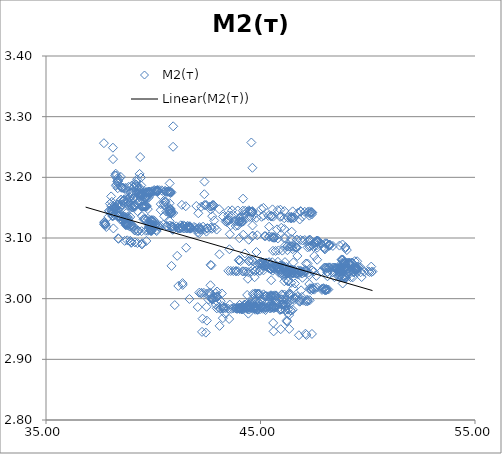
| Category | M2(т) |
|---|---|
| 36.8466682434082 | 1.551 |
| 37.6994400024414 | 3.256 |
| 38.1252288818359 | 3.23 |
| 38.2789344787598 | 3.203 |
| 38.2236251831055 | 3.203 |
| 38.2508888244629 | 3.206 |
| 38.4132614135742 | 3.198 |
| 38.4864120483398 | 3.201 |
| 38.3190498352051 | 3.198 |
| 38.3404922485352 | 3.194 |
| 38.292839050293 | 3.188 |
| 38.2607879638672 | 3.186 |
| 38.3443450927734 | 3.182 |
| 38.3514976501465 | 3.19 |
| 38.3239898681641 | 3.193 |
| 38.369815826416 | 3.194 |
| 38.4682922363281 | 3.186 |
| 38.5089530944824 | 3.184 |
| 38.521312713623 | 3.183 |
| 38.5624237060547 | 3.183 |
| 38.6135902404785 | 3.183 |
| 38.6564445495605 | 3.182 |
| 38.7172470092773 | 3.183 |
| 38.8511924743652 | 3.184 |
| 38.9959487915039 | 3.186 |
| 39.1181373596191 | 3.185 |
| 39.1987495422363 | 3.188 |
| 39.2380523681641 | 3.185 |
| 39.2809562683105 | 3.182 |
| 39.3547554016113 | 3.182 |
| 39.3679885864258 | 3.183 |
| 39.3649597167969 | 3.179 |
| 39.3949737548828 | 3.175 |
| 39.4136619567871 | 3.174 |
| 39.3420333862305 | 3.175 |
| 39.3627738952637 | 3.206 |
| 39.4356880187988 | 3.174 |
| 39.4679641723633 | 3.173 |
| 39.3996467590332 | 3.172 |
| 39.4515533447266 | 3.172 |
| 39.3494338989258 | 3.17 |
| 39.4420394897461 | 3.169 |
| 39.3887405395508 | 3.169 |
| 39.4053993225098 | 3.171 |
| 39.4506683349609 | 3.171 |
| 39.4600563049316 | 3.171 |
| 39.6278877258301 | 3.173 |
| 39.7151336669922 | 3.168 |
| 39.6557197570801 | 3.168 |
| 39.784236907959 | 3.166 |
| 39.6525421142578 | 3.164 |
| 39.6562728881836 | 3.167 |
| 39.6016159057617 | 3.167 |
| 39.5798721313477 | 3.168 |
| 39.6038475036621 | 3.167 |
| 39.6324806213379 | 3.173 |
| 39.6714248657227 | 3.175 |
| 39.6459350585937 | 3.176 |
| 39.676929473877 | 3.176 |
| 39.6829490661621 | 3.174 |
| 39.7198753356934 | 3.175 |
| 39.7467613220215 | 3.175 |
| 39.7862739562988 | 3.175 |
| 39.8236846923828 | 3.175 |
| 39.7817764282227 | 3.176 |
| 39.8027877807617 | 3.176 |
| 39.840145111084 | 3.176 |
| 39.8780059814453 | 3.175 |
| 39.9424476623535 | 3.176 |
| 40.0101356506348 | 3.177 |
| 40.0456466674805 | 3.179 |
| 40.0879516601562 | 3.178 |
| 40.1202392578125 | 3.178 |
| 40.154899597168 | 3.177 |
| 40.2038192749023 | 3.177 |
| 40.2207717895508 | 3.178 |
| 40.2089881896973 | 3.177 |
| 40.1680450439453 | 3.178 |
| 40.1817512512207 | 3.179 |
| 40.2020111083984 | 3.179 |
| 40.2154159545898 | 3.178 |
| 40.2009811401367 | 3.178 |
| 40.2103576660156 | 3.178 |
| 40.2322998046875 | 3.178 |
| 40.2776641845703 | 3.179 |
| 40.3890228271484 | 3.179 |
| 40.4242744445801 | 3.178 |
| 40.5500640869141 | 3.177 |
| 40.5572128295898 | 3.177 |
| 40.6336402893066 | 3.176 |
| 40.6303329467773 | 3.176 |
| 40.6712760925293 | 3.176 |
| 40.7076454162598 | 3.176 |
| 40.7392044067383 | 3.177 |
| 40.7707633972168 | 3.176 |
| 40.8457832336426 | 3.175 |
| 40.8117141723633 | 3.176 |
| 40.8083877563477 | 3.174 |
| 39.8167533874512 | 3.173 |
| 39.6430053710937 | 3.152 |
| 39.2664375305176 | 3.144 |
| 38.7043991088867 | 3.144 |
| 38.4202117919922 | 3.142 |
| 38.3407020568848 | 3.141 |
| 38.1084671020508 | 3.142 |
| 38.1073837280273 | 3.141 |
| 38.0158042907715 | 3.141 |
| 37.9384002685547 | 3.145 |
| 37.9482192993164 | 3.145 |
| 38.0468864440918 | 3.145 |
| 38.0695152282715 | 3.146 |
| 38.0815696716309 | 3.148 |
| 38.1715202331543 | 3.149 |
| 38.1314506530762 | 3.148 |
| 38.1841926574707 | 3.149 |
| 38.2325973510742 | 3.148 |
| 38.2218437194824 | 3.15 |
| 38.253734588623 | 3.149 |
| 38.4297752380371 | 3.149 |
| 38.3464736938477 | 3.152 |
| 38.3091354370117 | 3.147 |
| 38.251522064209 | 3.145 |
| 38.1932830810547 | 3.149 |
| 38.2493057250977 | 3.15 |
| 38.1490211486816 | 3.151 |
| 38.0419616699219 | 3.153 |
| 38.037052154541 | 3.169 |
| 38.1197319030762 | 3.249 |
| 38.0682678222656 | 3.16 |
| 38.195499420166 | 3.154 |
| 38.3160095214844 | 3.155 |
| 38.374641418457 | 3.155 |
| 38.5447387695313 | 3.155 |
| 38.8418121337891 | 3.154 |
| 38.955020904541 | 3.154 |
| 39.1231727600098 | 3.154 |
| 39.0814781188965 | 3.153 |
| 39.1459197998047 | 3.151 |
| 39.1146392822266 | 3.151 |
| 39.050350189209 | 3.15 |
| 38.9935302734375 | 3.151 |
| 39.0169525146484 | 3.151 |
| 39.0999794006348 | 3.152 |
| 39.1182098388672 | 3.152 |
| 39.1385803222656 | 3.155 |
| 39.1006889343262 | 3.183 |
| 39.2224159240723 | 3.193 |
| 39.1468620300293 | 3.189 |
| 39.2094764709473 | 3.188 |
| 39.3918075561523 | 3.233 |
| 39.4305267333984 | 3.2 |
| 39.4389686584473 | 3.187 |
| 39.4581451416016 | 3.17 |
| 39.44287109375 | 3.152 |
| 39.5500526428223 | 3.152 |
| 39.4846649169922 | 3.152 |
| 39.453857421875 | 3.152 |
| 39.4916687011719 | 3.152 |
| 39.5207862854004 | 3.152 |
| 39.578311920166 | 3.152 |
| 39.5894050598145 | 3.153 |
| 39.6257820129395 | 3.152 |
| 39.666446685791 | 3.154 |
| 39.6771850585937 | 3.152 |
| 39.6984939575195 | 3.153 |
| 39.7478637695313 | 3.148 |
| 39.8954429626465 | 3.172 |
| 39.9431648254395 | 3.177 |
| 39.8065910339355 | 3.176 |
| 39.8521766662598 | 3.175 |
| 39.868278503418 | 3.174 |
| 40.3340110778809 | 3.171 |
| 39.327808380127 | 3.173 |
| 38.7995300292969 | 3.177 |
| 38.991626739502 | 3.175 |
| 38.9982872009277 | 3.173 |
| 38.9430885314941 | 3.174 |
| 38.9925918579102 | 3.17 |
| 39.091869354248 | 3.166 |
| 38.8941497802734 | 3.168 |
| 38.9185523986816 | 3.166 |
| 38.8020248413086 | 3.132 |
| 38.8589744567871 | 3.132 |
| 38.775447845459 | 3.131 |
| 38.6370468139648 | 3.132 |
| 38.6057319641113 | 3.131 |
| 38.6423416137695 | 3.131 |
| 38.664436340332 | 3.13 |
| 38.5783500671387 | 3.129 |
| 38.4752883911133 | 3.13 |
| 38.5589218139648 | 3.129 |
| 38.6497039794922 | 3.164 |
| 38.5030975341797 | 3.163 |
| 38.496696472168 | 3.163 |
| 38.6072044372559 | 3.161 |
| 38.636905670166 | 3.163 |
| 38.6467628479004 | 3.162 |
| 38.610050201416 | 3.162 |
| 38.6395072937012 | 3.158 |
| 38.7244987487793 | 3.159 |
| 38.809154510498 | 3.163 |
| 38.8178863525391 | 3.16 |
| 38.9420967102051 | 3.156 |
| 38.8254432678223 | 3.125 |
| 38.7724266052246 | 3.124 |
| 38.7501754760742 | 3.124 |
| 38.9606018066406 | 3.123 |
| 38.9014053344727 | 3.124 |
| 38.8121948242188 | 3.124 |
| 38.7405624389648 | 3.122 |
| 38.7537879943848 | 3.123 |
| 38.6931381225586 | 3.124 |
| 38.7027015686035 | 3.125 |
| 38.7519302368164 | 3.124 |
| 38.6920127868652 | 3.124 |
| 38.7385330200195 | 3.141 |
| 38.7215881347656 | 3.131 |
| 38.7130126953125 | 3.121 |
| 38.7798538208008 | 3.121 |
| 38.8370323181152 | 3.121 |
| 38.9014167785645 | 3.119 |
| 38.9543991088867 | 3.12 |
| 38.9963531494141 | 3.12 |
| 39.0669364929199 | 3.12 |
| 39.1024780273438 | 3.117 |
| 39.1282997131348 | 3.113 |
| 39.148853302002 | 3.113 |
| 39.2411041259766 | 3.112 |
| 39.2872200012207 | 3.112 |
| 39.3078384399414 | 3.111 |
| 39.4544448852539 | 3.111 |
| 39.6471557617188 | 3.112 |
| 39.7491416931152 | 3.112 |
| 39.8859405517578 | 3.112 |
| 39.8912124633789 | 3.113 |
| 39.860408782959 | 3.113 |
| 39.9278564453125 | 3.112 |
| 39.9182281494141 | 3.113 |
| 39.8957824707031 | 3.112 |
| 39.8830146789551 | 3.113 |
| 39.9032211303711 | 3.114 |
| 39.889331817627 | 3.115 |
| 39.7785530090332 | 3.115 |
| 39.8928871154785 | 3.115 |
| 39.9346160888672 | 3.116 |
| 39.9755516052246 | 3.118 |
| 39.8780174255371 | 3.122 |
| 39.9108695983887 | 3.123 |
| 39.9489707946777 | 3.127 |
| 40.0525131225586 | 3.128 |
| 39.9914627075195 | 3.129 |
| 39.9455108642578 | 3.128 |
| 39.9452896118164 | 3.129 |
| 39.9015083312988 | 3.129 |
| 39.9266357421875 | 3.13 |
| 39.8418464660645 | 3.13 |
| 39.7503471374512 | 3.132 |
| 39.6369476318359 | 3.131 |
| 39.6120223999023 | 3.131 |
| 39.6067276000977 | 3.131 |
| 39.5427474975586 | 3.131 |
| 39.4790115356445 | 3.136 |
| 39.4441947937012 | 3.165 |
| 39.4007148742676 | 3.166 |
| 39.2907028198242 | 3.166 |
| 39.2226295471191 | 3.174 |
| 39.2482490539551 | 3.197 |
| 39.063404083252 | 3.164 |
| 39.091869354248 | 3.165 |
| 38.9248275756836 | 3.162 |
| 38.9293251037598 | 3.135 |
| 38.7998847961426 | 3.135 |
| 38.7319030761719 | 3.134 |
| 38.6788291931152 | 3.135 |
| 38.6014404296875 | 3.136 |
| 38.58935546875 | 3.135 |
| 38.5079345703125 | 3.136 |
| 38.3923950195313 | 3.135 |
| 38.3737525939941 | 3.136 |
| 38.3372840881348 | 3.136 |
| 38.3794441223145 | 3.136 |
| 38.4328308105469 | 3.136 |
| 38.3685111999512 | 3.137 |
| 38.3542289733887 | 3.136 |
| 38.2104263305664 | 3.138 |
| 38.1323394775391 | 3.137 |
| 38.1013565063477 | 3.137 |
| 38.1035652160645 | 3.136 |
| 37.9150390625 | 3.135 |
| 37.9805450439453 | 3.157 |
| 37.7783546447754 | 3.123 |
| 37.7770347595215 | 3.121 |
| 37.7066459655762 | 3.122 |
| 37.7183609008789 | 3.126 |
| 37.7170372009277 | 3.126 |
| 37.7328071594238 | 3.124 |
| 37.7420234680176 | 3.123 |
| 37.8122367858887 | 3.118 |
| 38.1417541503906 | 3.116 |
| 38.3659553527832 | 3.1 |
| 38.3780708312988 | 3.099 |
| 38.6676483154297 | 3.095 |
| 38.7870788574219 | 3.096 |
| 38.9253807067871 | 3.095 |
| 38.9381256103516 | 3.095 |
| 38.9854965209961 | 3.093 |
| 38.9722633361816 | 3.092 |
| 39.1452178955078 | 3.093 |
| 39.2611961364746 | 3.092 |
| 39.4820404052734 | 3.091 |
| 39.4731407165527 | 3.089 |
| 39.6801719665527 | 3.095 |
| 39.7836837768555 | 3.127 |
| 39.8151550292969 | 3.122 |
| 39.9658203125 | 3.123 |
| 40.0737648010254 | 3.121 |
| 40.1881942749023 | 3.121 |
| 40.287914276123 | 3.118 |
| 40.3494529724121 | 3.146 |
| 40.5062942504883 | 3.136 |
| 40.6074066162109 | 3.144 |
| 40.7360649108887 | 3.144 |
| 40.7737998962402 | 3.144 |
| 40.8051567077637 | 3.143 |
| 40.835636138916 | 3.141 |
| 40.8468894958496 | 3.141 |
| 40.8316040039063 | 3.14 |
| 40.8144302368164 | 3.14 |
| 40.932315826416 | 3.141 |
| 40.7516975402832 | 3.14 |
| 40.8481292724609 | 3.142 |
| 40.7739295959473 | 3.144 |
| 40.7965774536133 | 3.146 |
| 40.7961235046387 | 3.147 |
| 40.7968444824219 | 3.148 |
| 40.7682952880859 | 3.149 |
| 40.7666435241699 | 3.19 |
| 40.9297218322754 | 3.284 |
| 40.9250106811523 | 3.25 |
| 40.5572967529297 | 3.159 |
| 40.5504455566406 | 3.161 |
| 40.5598182678223 | 3.161 |
| 40.487678527832 | 3.158 |
| 40.5068244934082 | 3.154 |
| 40.35009765625 | 3.156 |
| 40.7653045654297 | 3.157 |
| 41.3327026367188 | 3.155 |
| 41.5155944824219 | 3.152 |
| 42.00830078125 | 3.153 |
| 42.2348327636719 | 3.151 |
| 42.7167892456055 | 3.152 |
| 42.3842277526855 | 3.154 |
| 42.4523963928223 | 3.154 |
| 42.8240699768066 | 3.154 |
| 42.7607917785645 | 3.154 |
| 42.7823333740234 | 3.155 |
| 42.8251037597656 | 3.154 |
| 42.728759765625 | 3.153 |
| 42.6401443481445 | 3.152 |
| 42.4693031311035 | 3.154 |
| 42.3815536499023 | 3.172 |
| 42.3883285522461 | 3.193 |
| 40.7673950195313 | 3.128 |
| 40.2436637878418 | 3.119 |
| 40.9234237670898 | 3.114 |
| 40.9061813354492 | 3.113 |
| 41.1469383239746 | 3.116 |
| 41.6971244812012 | 3.115 |
| 42.0052680969238 | 3.114 |
| 42.199893951416 | 3.114 |
| 42.2527847290039 | 3.114 |
| 42.182445526123 | 3.115 |
| 42.0988006591797 | 3.115 |
| 41.7291145324707 | 3.116 |
| 41.5760650634766 | 3.117 |
| 41.3604927062988 | 3.117 |
| 41.1958503723145 | 3.116 |
| 41.152400970459 | 3.117 |
| 40.9412460327148 | 3.118 |
| 40.8941459655762 | 3.118 |
| 40.8450393676758 | 3.119 |
| 40.770320892334 | 3.121 |
| 40.6128997802734 | 3.12 |
| 40.4683036804199 | 3.122 |
| 40.2287940979004 | 3.12 |
| 40.1058921813965 | 3.121 |
| 39.8997917175293 | 3.122 |
| 39.9675903320313 | 3.122 |
| 40.0024032592773 | 3.119 |
| 40.1382942199707 | 3.113 |
| 40.1584510803223 | 3.111 |
| 40.0749130249023 | 3.118 |
| 39.8869972229004 | 3.12 |
| 39.8195953369141 | 3.119 |
| 39.9309768676758 | 3.12 |
| 39.8077926635742 | 3.12 |
| 40.3221054077148 | 3.12 |
| 40.6460189819336 | 3.12 |
| 40.8644828796387 | 3.119 |
| 41.0732841491699 | 3.119 |
| 41.4582748413086 | 3.12 |
| 41.6849021911621 | 3.118 |
| 41.8998718261719 | 3.118 |
| 42.1544761657715 | 3.118 |
| 42.3233642578125 | 3.119 |
| 42.5246162414551 | 3.116 |
| 42.6884460449219 | 3.117 |
| 42.8500900268555 | 3.117 |
| 42.955379486084 | 3.114 |
| 42.7236061096191 | 3.115 |
| 42.5124130249023 | 3.115 |
| 42.4139022827148 | 3.115 |
| 42.1539268493652 | 3.116 |
| 41.9674186706543 | 3.117 |
| 41.772331237793 | 3.116 |
| 41.7276344299316 | 3.115 |
| 41.552547454834 | 3.117 |
| 41.4322700500488 | 3.116 |
| 41.3302612304687 | 3.117 |
| 41.2588768005371 | 3.116 |
| 41.2427787780762 | 3.116 |
| 41.3566131591797 | 3.118 |
| 41.2838859558105 | 3.121 |
| 41.3966789245605 | 3.121 |
| 41.6122512817383 | 3.12 |
| 41.5923652648926 | 3.12 |
| 41.7057685852051 | 3.119 |
| 41.6770858764648 | 3.117 |
| 41.6771659851074 | 3.118 |
| 41.722469329834 | 3.117 |
| 41.7500839233398 | 3.117 |
| 41.5450096130371 | 3.116 |
| 41.5947151184082 | 3.116 |
| 41.5343475341797 | 3.084 |
| 41.3660545349121 | 3.026 |
| 41.1681632995605 | 3.021 |
| 41.3730430603027 | 3.023 |
| 41.1160888671875 | 3.071 |
| 41.3185691833496 | 3.117 |
| 42.1013832092285 | 3.141 |
| 42.6840400695801 | 3.147 |
| 43.0749397277832 | 3.147 |
| 43.5007019042969 | 3.145 |
| 43.678394317627 | 3.146 |
| 43.9417915344238 | 3.145 |
| 44.1777229309082 | 3.145 |
| 44.2868766784668 | 3.145 |
| 44.4133758544922 | 3.144 |
| 44.4562835693359 | 3.146 |
| 44.5097923278809 | 3.144 |
| 44.5850219726562 | 3.144 |
| 44.6205177307129 | 3.144 |
| 44.621768951416 | 3.142 |
| 44.6177673339844 | 3.143 |
| 44.5895042419434 | 3.143 |
| 44.5570259094238 | 3.143 |
| 44.6231689453125 | 3.216 |
| 44.5733489990234 | 3.257 |
| 44.1857223510742 | 3.165 |
| 43.9425888061523 | 3.121 |
| 43.8432960510254 | 3.12 |
| 43.6144485473633 | 3.121 |
| 43.5322113037109 | 3.129 |
| 43.4332160949707 | 3.126 |
| 43.3750534057617 | 3.127 |
| 43.5173263549805 | 3.132 |
| 43.4488906860352 | 3.129 |
| 43.4237251281738 | 3.129 |
| 43.4955825805664 | 3.13 |
| 43.760555267334 | 3.128 |
| 43.8561859130859 | 3.128 |
| 43.9407424926758 | 3.128 |
| 43.9990119934082 | 3.126 |
| 44.1057739257812 | 3.126 |
| 44.1950187683105 | 3.127 |
| 44.132137298584 | 3.126 |
| 44.1474838256836 | 3.127 |
| 44.0995483398438 | 3.126 |
| 44.0567665100098 | 3.127 |
| 44.0087089538574 | 3.127 |
| 44.0809059143066 | 3.133 |
| 44.0091209411621 | 3.132 |
| 44.0137634277344 | 3.1 |
| 43.539852142334 | 2.967 |
| 43.243408203125 | 2.968 |
| 43.0928916931152 | 2.955 |
| 43.2272911071777 | 2.988 |
| 43.1454429626465 | 2.996 |
| 42.9504661560059 | 2.996 |
| 42.981990814209 | 3.003 |
| 42.9911270141602 | 3.003 |
| 42.9657402038574 | 3.004 |
| 42.9591407775879 | 3.003 |
| 42.9046440124512 | 3.002 |
| 42.8694267272949 | 3.002 |
| 42.8040428161621 | 3.002 |
| 42.7572479248047 | 3.001 |
| 42.7334823608398 | 3 |
| 42.7448081970215 | 3 |
| 42.7453422546387 | 3 |
| 42.7564125061035 | 2.998 |
| 42.715705871582 | 2.999 |
| 42.6686401367188 | 3.022 |
| 42.7111625671387 | 3.055 |
| 42.5720329284668 | 2.998 |
| 42.2993125915527 | 2.967 |
| 42.2736892700195 | 2.945 |
| 42.4515800476074 | 2.944 |
| 42.4994430541992 | 2.964 |
| 42.6739044189453 | 3.056 |
| 42.8443298339844 | 3.129 |
| 43.2516288757324 | 3.135 |
| 43.495979309082 | 3.137 |
| 44.0441436767578 | 3.134 |
| 44.486629486084 | 3.135 |
| 44.8056488037109 | 3.133 |
| 45.1423683166504 | 3.137 |
| 45.3704376220703 | 3.137 |
| 45.5232429504395 | 3.136 |
| 45.5973625183105 | 3.135 |
| 45.9724044799805 | 3.136 |
| 46.2575073242188 | 3.134 |
| 46.5669059753418 | 3.134 |
| 46.2907981872559 | 3.133 |
| 46.4642906188965 | 3.134 |
| 46.4630126953125 | 3.133 |
| 46.4377250671387 | 3.133 |
| 46.4135818481445 | 3.132 |
| 46.5559349060059 | 3.133 |
| 46.827205657959 | 3.131 |
| 46.1082153320313 | 3.133 |
| 44.5765953063965 | 3.135 |
| 44.1896514892578 | 3.134 |
| 43.6264228820801 | 3.137 |
| 42.748176574707 | 3.136 |
| 42.4766883850098 | 3.111 |
| 42.0685424804687 | 3.109 |
| 42.1413841247559 | 3.108 |
| 43.5722274780273 | 3.106 |
| 44.195686340332 | 3.105 |
| 44.8475875854492 | 3.105 |
| 45.1893692016602 | 3.103 |
| 45.2358512878418 | 3.103 |
| 45.4028129577637 | 3.103 |
| 45.405460357666 | 3.102 |
| 45.5218200683594 | 3.102 |
| 45.5841522216797 | 3.102 |
| 45.5965805053711 | 3.101 |
| 45.6159973144531 | 3.101 |
| 45.6312942504883 | 3.102 |
| 45.6663360595703 | 3.1 |
| 45.8107719421387 | 3.099 |
| 46.0968704223633 | 3.1 |
| 46.1508560180664 | 3.1 |
| 46.4222106933594 | 3.098 |
| 46.7028999328613 | 3.097 |
| 46.6903190612793 | 3.097 |
| 46.8613548278809 | 3.097 |
| 46.9676780700684 | 3.096 |
| 47.0625457763672 | 3.097 |
| 47.2122802734375 | 3.094 |
| 47.2562980651855 | 3.096 |
| 47.3001976013184 | 3.097 |
| 47.3238830566406 | 3.096 |
| 47.6293678283691 | 3.096 |
| 47.6438598632812 | 3.096 |
| 47.6304168701172 | 3.095 |
| 47.7070388793945 | 3.095 |
| 47.6133728027344 | 3.095 |
| 47.6036949157715 | 3.095 |
| 47.6183013916016 | 3.094 |
| 47.6702537536621 | 3.095 |
| 47.6185111999512 | 3.094 |
| 47.6535263061523 | 3.094 |
| 47.5188751220703 | 3.093 |
| 47.5789833068848 | 3.092 |
| 48.0847244262695 | 3.091 |
| 48.012321472168 | 3.091 |
| 48.0898361206055 | 3.09 |
| 48.2277717590332 | 3.089 |
| 48.2334098815918 | 3.088 |
| 48.1977424621582 | 3.089 |
| 48.2097244262695 | 3.087 |
| 47.920581817627 | 3.086 |
| 47.8298683166504 | 3.091 |
| 47.6311836242676 | 3.088 |
| 47.4225730895996 | 3.088 |
| 47.3089294433594 | 3.087 |
| 47.1954116821289 | 3.085 |
| 46.7027893066406 | 3.084 |
| 46.4505424499512 | 3.087 |
| 46.3530883789063 | 3.086 |
| 46.2669944763184 | 3.087 |
| 46.1399917602539 | 3.087 |
| 46.239688873291 | 3.086 |
| 46.394832611084 | 3.086 |
| 46.5088500976562 | 3.086 |
| 46.6332359313965 | 3.084 |
| 46.7061805725098 | 3.084 |
| 46.6623725891113 | 3.084 |
| 46.6573638916016 | 3.085 |
| 46.4563941955566 | 3.11 |
| 46.1119117736816 | 3.115 |
| 45.9715270996094 | 3.117 |
| 45.7717552185059 | 3.114 |
| 45.4950370788574 | 3.135 |
| 45.1360244750977 | 3.15 |
| 45.0320472717285 | 3.148 |
| 45.5603446960449 | 3.147 |
| 45.8027496337891 | 3.146 |
| 45.9268226623535 | 3.147 |
| 46.113655090332 | 3.144 |
| 46.5005569458008 | 3.144 |
| 46.7479591369629 | 3.142 |
| 46.8698463439941 | 3.144 |
| 46.8789939880371 | 3.143 |
| 47.0639839172363 | 3.143 |
| 47.2009391784668 | 3.143 |
| 47.280590057373 | 3.144 |
| 47.2806739807129 | 3.141 |
| 47.3621520996094 | 3.143 |
| 47.3414573669434 | 3.142 |
| 47.3952751159668 | 3.143 |
| 47.4144134521484 | 3.142 |
| 47.3860626220703 | 3.139 |
| 47.2784996032715 | 3.137 |
| 46.954158782959 | 3.135 |
| 46.4309463500977 | 3.135 |
| 45.9147491455078 | 3.135 |
| 45.4894332885742 | 3.136 |
| 45.0521621704102 | 3.135 |
| 44.6488227844238 | 3.136 |
| 44.2579040527344 | 3.139 |
| 44.2708511352539 | 3.075 |
| 44.0725479125977 | 3.062 |
| 44.0009689331055 | 3.064 |
| 43.9929885864258 | 3.063 |
| 44.4594764709473 | 3.061 |
| 44.5947189331055 | 3.063 |
| 44.6543960571289 | 3.062 |
| 45.0279846191406 | 3.061 |
| 45.3758163452148 | 3.059 |
| 45.5505294799805 | 3.06 |
| 45.811107635498 | 3.061 |
| 46.1409187316895 | 3.06 |
| 46.5342445373535 | 3.06 |
| 47.1186599731445 | 3.058 |
| 47.1960372924805 | 3.058 |
| 47.6432037353516 | 3.064 |
| 48.2092247009277 | 3.089 |
| 48.3736610412598 | 3.087 |
| 48.6837615966797 | 3.087 |
| 48.8235855102539 | 3.089 |
| 48.9542427062988 | 3.083 |
| 48.9644393920898 | 3.085 |
| 49.0256385803223 | 3.08 |
| 49.0178298950195 | 3.051 |
| 49.0243492126465 | 3.044 |
| 48.9084243774414 | 3.045 |
| 48.7630271911621 | 3.046 |
| 48.7224082946777 | 3.046 |
| 48.7636489868164 | 3.046 |
| 48.7141418457031 | 3.044 |
| 48.6787528991699 | 3.044 |
| 48.4080581665039 | 3.045 |
| 48.3767356872559 | 3.043 |
| 48.1061515808105 | 3.044 |
| 47.9365653991699 | 3.017 |
| 47.3987312316895 | 2.942 |
| 47.0946922302246 | 2.942 |
| 47.1410064697266 | 2.94 |
| 46.7901039123535 | 2.94 |
| 46.3419151306152 | 2.95 |
| 46.2251129150391 | 2.964 |
| 46.2343635559082 | 2.962 |
| 46.2863960266113 | 2.976 |
| 45.5918884277344 | 2.96 |
| 45.7432327270508 | 3.605 |
| 46.1293106079102 | 3.723 |
| 45.9106369018555 | 3.715 |
| 45.5552101135254 | 3.436 |
| 44.6464500427246 | 3.048 |
| 44.4291191101074 | 3.044 |
| 44.2522506713867 | 3.045 |
| 44.1737442016602 | 3.045 |
| 43.6110000610352 | 3.046 |
| 43.4989128112793 | 3.046 |
| 43.8412246704102 | 3.045 |
| 43.7345428466797 | 3.046 |
| 43.8779449462891 | 3.045 |
| 43.9614219665527 | 3.045 |
| 44.1643180847168 | 3.045 |
| 44.3325881958008 | 3.045 |
| 44.5504875183105 | 3.045 |
| 44.714656829834 | 3.045 |
| 44.7829704284668 | 3.046 |
| 44.9414138793945 | 3.046 |
| 44.9846382141113 | 3.046 |
| 45.1377067565918 | 3.047 |
| 45.5671920776367 | 3.046 |
| 45.4018745422363 | 3.06 |
| 45.2605094909668 | 3.059 |
| 45.1346206665039 | 3.059 |
| 45.0097541809082 | 3.058 |
| 45.0673332214355 | 3.059 |
| 45.1408500671387 | 3.059 |
| 44.9256362915039 | 3.058 |
| 45.0482177734375 | 3.058 |
| 44.846118927002 | 3.056 |
| 44.9780960083008 | 3.057 |
| 45.2099189758301 | 3.057 |
| 45.2935256958008 | 3.055 |
| 45.4687271118164 | 3.055 |
| 45.234317779541 | 3.055 |
| 45.2096252441406 | 3.055 |
| 45.0890960693359 | 3.054 |
| 45.2400398254395 | 3.054 |
| 45.517333984375 | 3.053 |
| 45.7754859924316 | 3.052 |
| 45.8626480102539 | 3.052 |
| 45.8495979309082 | 3.053 |
| 46.0246429443359 | 3.051 |
| 46.2043228149414 | 3.052 |
| 46.021900177002 | 3.053 |
| 46.1280174255371 | 3.05 |
| 46.0734596252441 | 3.051 |
| 46.0764999389648 | 3.053 |
| 46.143424987793 | 3.05 |
| 46.0175590515137 | 3.054 |
| 46.0253486633301 | 3.053 |
| 45.9128761291504 | 3.055 |
| 45.8609962463379 | 3.051 |
| 45.8792037963867 | 3.051 |
| 45.5437850952148 | 3.051 |
| 45.609504699707 | 3.05 |
| 45.5305366516113 | 3.052 |
| 45.3764762878418 | 3.05 |
| 45.6056480407715 | 3.051 |
| 45.6366996765137 | 3.05 |
| 45.8255729675293 | 3.05 |
| 45.6003913879395 | 3.051 |
| 45.4917411804199 | 3.049 |
| 45.5040092468262 | 3.049 |
| 45.4537773132324 | 3.049 |
| 45.4832420349121 | 3.048 |
| 45.6903114318848 | 3.052 |
| 45.7362365722656 | 3.055 |
| 45.8075103759766 | 3.051 |
| 45.8097305297852 | 3.049 |
| 45.7890892028809 | 3.049 |
| 45.8784027099609 | 3.048 |
| 45.9588775634766 | 3.048 |
| 46.285400390625 | 3.049 |
| 46.0361976623535 | 3.05 |
| 46.2828903198242 | 3.048 |
| 46.3733787536621 | 3.048 |
| 46.453987121582 | 3.048 |
| 46.5891799926758 | 3.047 |
| 46.524959564209 | 3.047 |
| 46.5014381408691 | 3.047 |
| 46.8623542785645 | 3.046 |
| 47.0863838195801 | 3.047 |
| 47.0884132385254 | 3.046 |
| 47.3889122009277 | 3.047 |
| 47.4063720703125 | 3.047 |
| 46.7586250305176 | 3.047 |
| 47.1466102600098 | 3.045 |
| 47.0492401123047 | 3.045 |
| 46.8954658508301 | 3.044 |
| 46.9313545227051 | 3.044 |
| 47.041088104248 | 3.043 |
| 46.7863426208496 | 3.045 |
| 46.8628921508789 | 3.043 |
| 46.9445190429687 | 3.041 |
| 46.8690032958984 | 3.043 |
| 46.7509078979492 | 3.043 |
| 46.5100212097168 | 3.042 |
| 46.3304710388184 | 3.042 |
| 46.2640228271484 | 3.042 |
| 46.2838096618652 | 3.042 |
| 46.2149772644043 | 3.041 |
| 46.1646308898926 | 3.041 |
| 46.2587089538574 | 3.043 |
| 46.309871673584 | 3.043 |
| 46.4101486206055 | 3.042 |
| 46.4716148376465 | 3.043 |
| 46.4744911193848 | 3.042 |
| 46.6221466064453 | 3.043 |
| 46.6063079833984 | 3.043 |
| 46.662467956543 | 3.042 |
| 46.7144050598145 | 3.042 |
| 46.6631202697754 | 3.041 |
| 46.4621276855469 | 3.041 |
| 46.2146148681641 | 3.043 |
| 45.9412231445313 | 3.042 |
| 45.8549613952637 | 3.043 |
| 46.0016593933105 | 3.043 |
| 46.096118927002 | 3.041 |
| 46.5514755249023 | 3.042 |
| 46.7640800476074 | 3.04 |
| 46.9585876464844 | 3.034 |
| 47.2748908996582 | 3.039 |
| 47.6035194396973 | 3.038 |
| 48.1223411560059 | 3.037 |
| 48.4483451843262 | 3.035 |
| 48.6435317993164 | 3.036 |
| 48.6869277954102 | 3.036 |
| 48.8631820678711 | 3.035 |
| 48.9726943969727 | 3.034 |
| 49.0158805847168 | 3.037 |
| 48.8202247619629 | 3.035 |
| 48.9006271362305 | 3.036 |
| 49.2057495117188 | 3.035 |
| 49.3027000427246 | 3.035 |
| 48.9050254821777 | 3.037 |
| 48.9432220458984 | 3.035 |
| 48.9768714904785 | 3.035 |
| 48.830867767334 | 3.025 |
| 48.6558685302734 | 3.046 |
| 43.0849494934082 | 3.073 |
| 40.8505401611328 | 3.054 |
| 41.6856803894043 | 2.999 |
| 41.0025482177734 | 2.989 |
| 42.0736083984375 | 2.986 |
| 43.0594711303711 | 2.985 |
| 43.3387680053711 | 2.976 |
| 44.4336929321289 | 2.975 |
| 44.9676933288574 | 2.996 |
| 45.2556991577148 | 3.004 |
| 45.3604431152344 | 3.004 |
| 45.549488067627 | 3.004 |
| 45.6508598327637 | 3.003 |
| 45.4746437072754 | 3.004 |
| 45.4496421813965 | 3.003 |
| 45.201847076416 | 3.004 |
| 44.951847076416 | 3.004 |
| 45.2126083374023 | 3.004 |
| 45.5345993041992 | 3.005 |
| 45.9919281005859 | 3.007 |
| 46.3028793334961 | 3.008 |
| 46.4378356933594 | 3.006 |
| 46.4004707336426 | 3.007 |
| 46.3900871276855 | 3.007 |
| 46.3574714660645 | 3.009 |
| 46.1151275634766 | 3.007 |
| 46.4923133850098 | 3.097 |
| 46.7192535400391 | 3.07 |
| 46.333812713623 | 2.973 |
| 45.9073638916016 | 2.981 |
| 46.2460784912109 | 2.993 |
| 46.0445899963379 | 2.991 |
| 46.228199005127 | 2.992 |
| 45.9817733764648 | 2.99 |
| 46.0524520874023 | 2.991 |
| 46.0705261230469 | 2.99 |
| 46.0169563293457 | 2.99 |
| 46.1556358337402 | 2.991 |
| 45.9908905029297 | 2.99 |
| 46.0573425292969 | 2.991 |
| 46.1715660095215 | 2.989 |
| 46.3549537658691 | 2.991 |
| 46.0162773132324 | 2.99 |
| 45.5847587585449 | 2.989 |
| 45.4482765197754 | 2.99 |
| 45.2985649108887 | 2.993 |
| 44.8485870361328 | 2.995 |
| 44.5127792358398 | 2.991 |
| 44.2800521850586 | 2.99 |
| 44.563720703125 | 2.992 |
| 44.4818649291992 | 3.063 |
| 44.6452484130859 | 3.104 |
| 44.6073608398438 | 3.103 |
| 44.6278381347656 | 3.121 |
| 44.7243385314941 | 3.035 |
| 44.4611701965332 | 2.99 |
| 44.4307823181152 | 2.99 |
| 44.4186744689941 | 2.987 |
| 44.4327659606934 | 2.988 |
| 44.4247970581055 | 2.987 |
| 44.4714660644531 | 2.986 |
| 44.4747543334961 | 2.986 |
| 44.5408821105957 | 2.987 |
| 44.3540382385254 | 2.987 |
| 44.2605781555176 | 2.985 |
| 44.3480567932129 | 2.985 |
| 44.378776550293 | 2.986 |
| 44.4906997680664 | 2.985 |
| 44.6217956542969 | 2.985 |
| 44.6992301940918 | 2.985 |
| 44.7754554748535 | 2.985 |
| 44.7311058044434 | 2.986 |
| 44.6780815124512 | 2.986 |
| 44.6974830627441 | 2.985 |
| 44.5238647460937 | 2.986 |
| 44.2889556884766 | 2.985 |
| 44.1439971923828 | 2.986 |
| 44.0216598510742 | 2.99 |
| 43.8913879394531 | 2.985 |
| 43.9265670776367 | 2.984 |
| 44.0066757202148 | 2.985 |
| 43.8458251953125 | 2.984 |
| 43.7226905822754 | 2.984 |
| 43.7660255432129 | 2.985 |
| 43.8564262390137 | 2.984 |
| 43.9257698059082 | 2.986 |
| 44.0350532531738 | 2.984 |
| 44.3650245666504 | 2.984 |
| 44.307991027832 | 2.985 |
| 44.02099609375 | 2.985 |
| 44.0128784179687 | 2.984 |
| 44.0669898986816 | 2.985 |
| 44.0271263122559 | 2.984 |
| 44.081298828125 | 2.985 |
| 44.0978126525879 | 2.984 |
| 44.140682220459 | 2.983 |
| 44.1464653015137 | 2.987 |
| 44.1303939819336 | 2.983 |
| 44.1128997802734 | 2.983 |
| 44.0328674316406 | 2.983 |
| 43.9549446105957 | 2.984 |
| 43.9060859680176 | 2.983 |
| 44.3816032409668 | 2.984 |
| 44.8549270629883 | 2.982 |
| 45.1823425292969 | 2.983 |
| 43.313835144043 | 2.986 |
| 42.4840888977051 | 2.987 |
| 42.9628868103027 | 2.984 |
| 43.2713317871094 | 2.985 |
| 43.268856048584 | 2.984 |
| 43.3777732849121 | 2.985 |
| 43.2317428588867 | 2.984 |
| 43.1202735900879 | 2.984 |
| 43.4870719909668 | 2.983 |
| 43.6343421936035 | 2.983 |
| 44.1861915588379 | 2.983 |
| 44.6662635803223 | 2.984 |
| 45.003532409668 | 2.986 |
| 45.18505859375 | 2.985 |
| 44.7664756774902 | 2.987 |
| 44.9303817749023 | 2.994 |
| 45.0775833129883 | 2.997 |
| 45.4009552001953 | 3.119 |
| 45.4971542358398 | 3.03 |
| 45.306713104248 | 2.986 |
| 45.3595085144043 | 2.986 |
| 45.3885459899902 | 2.987 |
| 45.4988059997559 | 2.988 |
| 45.7175788879395 | 2.986 |
| 45.6162300109863 | 2.987 |
| 45.5327453613281 | 2.986 |
| 45.2632637023926 | 2.985 |
| 45.0583915710449 | 2.985 |
| 45.0586471557617 | 2.986 |
| 44.987361907959 | 2.987 |
| 45.2350387573242 | 2.986 |
| 45.5220222473145 | 2.985 |
| 45.4470443725586 | 2.986 |
| 45.6313819885254 | 2.985 |
| 45.9676246643066 | 2.983 |
| 45.9699935913086 | 2.983 |
| 45.9179840087891 | 2.982 |
| 45.8193054199219 | 2.993 |
| 45.7836418151855 | 2.989 |
| 45.4434394836426 | 2.984 |
| 45.0932960510254 | 2.983 |
| 45.1098976135254 | 2.986 |
| 44.9748611450195 | 2.983 |
| 44.7574615478516 | 2.982 |
| 44.7122840881348 | 2.984 |
| 44.4009475708008 | 2.982 |
| 44.4756660461426 | 2.982 |
| 44.7802886962891 | 2.984 |
| 44.8667869567871 | 2.982 |
| 44.8252983093262 | 2.983 |
| 44.8575286865234 | 2.983 |
| 45.2354774475098 | 2.981 |
| 45.9154624938965 | 2.982 |
| 45.9867973327637 | 2.982 |
| 46.1578407287598 | 2.981 |
| 46.4095268249512 | 2.981 |
| 46.4016418457031 | 2.981 |
| 46.5034980773926 | 2.982 |
| 46.2822799682617 | 2.982 |
| 46.1597671508789 | 2.981 |
| 45.9438133239746 | 2.95 |
| 45.6146202087402 | 2.985 |
| 45.9946022033691 | 2.999 |
| 45.7207412719727 | 3.004 |
| 45.6873054504395 | 2.997 |
| 45.9984817504883 | 3.043 |
| 46.0323066711426 | 3.039 |
| 46.2482948303223 | 3.041 |
| 46.3307762145996 | 3.044 |
| 47.4853096008301 | 3.045 |
| 47.8330764770508 | 3.045 |
| 48.126579284668 | 3.044 |
| 48.4363632202148 | 3.044 |
| 48.6346588134766 | 3.045 |
| 48.6562194824219 | 3.045 |
| 49.1119804382324 | 3.044 |
| 49.4838066101074 | 3.045 |
| 49.3283882141113 | 3.044 |
| 49.4352149963379 | 3.045 |
| 49.6672782897949 | 3.044 |
| 49.8291969299316 | 3.044 |
| 50.0859222412109 | 3.044 |
| 50.2211799621582 | 3.045 |
| 50.1783752441406 | 3.044 |
| 50.1615257263184 | 3.053 |
| 50.0225791931152 | 3.045 |
| 49.7163505554199 | 3.036 |
| 49.6647109985352 | 3.052 |
| 49.5058326721191 | 3.062 |
| 49.393970489502 | 3.062 |
| 48.9518013000488 | 3.059 |
| 48.9587249755859 | 3.059 |
| 49.2813301086426 | 3.059 |
| 49.2778167724609 | 3.059 |
| 49.150260925293 | 3.059 |
| 49.1371116638184 | 3.058 |
| 49.1790046691895 | 3.058 |
| 49.2269592285156 | 3.059 |
| 49.1411895751953 | 3.057 |
| 48.9327926635742 | 3.057 |
| 49.2725105285645 | 3.059 |
| 49.1563186645508 | 3.058 |
| 49.1141586303711 | 3.059 |
| 49.0502090454102 | 3.059 |
| 48.9141845703125 | 3.058 |
| 48.947322845459 | 3.059 |
| 48.8625373840332 | 3.059 |
| 48.8878898620605 | 3.061 |
| 48.792724609375 | 3.059 |
| 48.7922058105469 | 3.065 |
| 48.8345947265625 | 3.065 |
| 48.7868232727051 | 3.065 |
| 48.808048248291 | 3.063 |
| 48.8461418151855 | 3.05 |
| 48.6893539428711 | 3.039 |
| 48.786693572998 | 3.035 |
| 48.7769546508789 | 3.035 |
| 49.0949096679687 | 3.041 |
| 49.3384857177734 | 3.043 |
| 49.3769912719727 | 3.049 |
| 49.5463333129883 | 3.053 |
| 49.5919952392578 | 3.052 |
| 49.4367637634277 | 3.052 |
| 49.5218849182129 | 3.051 |
| 49.4614944458008 | 3.05 |
| 49.4849281311035 | 3.05 |
| 49.4745254516602 | 3.049 |
| 49.4781684875488 | 3.049 |
| 49.4822845458984 | 3.048 |
| 49.4838180541992 | 3.049 |
| 49.471492767334 | 3.048 |
| 49.4599342346191 | 3.048 |
| 49.4483222961426 | 3.049 |
| 49.3708267211914 | 3.048 |
| 49.4437866210937 | 3.049 |
| 49.4348678588867 | 3.048 |
| 49.2804298400879 | 3.047 |
| 49.0469169616699 | 3.048 |
| 49.0520515441895 | 3.049 |
| 48.9066619873047 | 3.049 |
| 48.9209403991699 | 3.049 |
| 48.8646621704102 | 3.049 |
| 48.9111175537109 | 3.05 |
| 48.9043006896973 | 3.051 |
| 48.5539398193359 | 3.05 |
| 48.4620361328125 | 3.05 |
| 48.504753112793 | 3.051 |
| 48.245475769043 | 3.052 |
| 48.101936340332 | 3.051 |
| 48.0025863647461 | 3.051 |
| 48.0217208862305 | 3.051 |
| 47.9672431945801 | 3.051 |
| 48.1820869445801 | 3.051 |
| 48.0739593505859 | 3.051 |
| 48.1799049377441 | 3.052 |
| 48.3676490783691 | 3.051 |
| 48.4363212585449 | 3.051 |
| 48.516529083252 | 3.05 |
| 48.6088600158691 | 3.049 |
| 48.6828193664551 | 3.049 |
| 48.8727798461914 | 3.051 |
| 48.6713409423828 | 3.05 |
| 48.663330078125 | 3.051 |
| 48.7185440063477 | 3.049 |
| 48.6055335998535 | 3.05 |
| 48.5284194946289 | 3.049 |
| 48.565185546875 | 3.049 |
| 48.7493057250977 | 3.05 |
| 48.7184562683105 | 3.048 |
| 48.8046112060547 | 3.048 |
| 48.7414703369141 | 3.049 |
| 48.7994422912598 | 3.048 |
| 48.9302978515625 | 3.049 |
| 48.846363067627 | 3.05 |
| 49.0835227966309 | 2.525 |
| 39.7054100036621 | 0.845 |
| 44.4111709594727 | 3.033 |
| 46.6064643859863 | 3.025 |
| 47.6560440063477 | 3.019 |
| 47.2441024780273 | 3.043 |
| 47.5079574584961 | 3.07 |
| 47.2935180664063 | 3.015 |
| 46.2931022644043 | 3.028 |
| 46.2555541992188 | 3.029 |
| 46.1105651855469 | 3.029 |
| 46.4334144592285 | 3.026 |
| 46.3104476928711 | 3.029 |
| 44.7574195861816 | 2.996 |
| 45.6130828857422 | 2.946 |
| 45.4418106079102 | 3 |
| 45.9744873046875 | 2.998 |
| 45.6950874328613 | 2.997 |
| 46.1062240600586 | 2.999 |
| 46.2243461608887 | 2.998 |
| 46.4192771911621 | 2.998 |
| 46.6211051940918 | 2.999 |
| 46.9024047851562 | 2.999 |
| 47.1809616088867 | 2.999 |
| 47.1992988586426 | 2.997 |
| 47.2946166992188 | 2.997 |
| 47.1061630249023 | 2.996 |
| 47.1846199035645 | 2.996 |
| 46.8345527648926 | 2.995 |
| 46.7990837097168 | 2.996 |
| 47.0006980895996 | 2.997 |
| 46.8321266174316 | 2.998 |
| 46.7220764160156 | 3.003 |
| 46.9251594543457 | 3.003 |
| 46.6184349060059 | 3.002 |
| 46.4926834106445 | 3.004 |
| 45.9895401000977 | 3.006 |
| 45.4881057739258 | 3.006 |
| 45.270565032959 | 3.004 |
| 45.4524955749512 | 3.005 |
| 45.6551933288574 | 3.005 |
| 45.7286415100098 | 3.005 |
| 45.713695526123 | 3.004 |
| 45.5912742614746 | 3.005 |
| 45.6764755249023 | 3.004 |
| 45.1422729492188 | 3.007 |
| 44.9519004821777 | 3.008 |
| 44.7410163879395 | 3.009 |
| 44.6428756713867 | 3.008 |
| 44.8462944030762 | 3.008 |
| 44.8941993713379 | 3.007 |
| 44.9095001220703 | 3.007 |
| 44.8884429931641 | 3.007 |
| 44.6962776184082 | 3.007 |
| 44.3793334960937 | 3.006 |
| 44.4526214599609 | 3.097 |
| 43.5513038635254 | 3.081 |
| 42.9039268493652 | 3.009 |
| 43.200023651123 | 3.009 |
| 42.9759635925293 | 3.012 |
| 42.6250305175781 | 3.01 |
| 42.613037109375 | 3.008 |
| 42.3593978881836 | 3.01 |
| 42.2369117736816 | 3.009 |
| 42.2494468688965 | 3.01 |
| 42.1421318054199 | 3.01 |
| 42.4902763366699 | 3.008 |
| 42.6985511779785 | 3.008 |
| 42.9185371398926 | 2.99 |
| 43.5675506591797 | 2.99 |
| 44.0260963439941 | 2.99 |
| 44.2261657714844 | 2.989 |
| 44.3514099121094 | 2.991 |
| 44.4648475646973 | 2.991 |
| 44.6047782897949 | 2.99 |
| 44.8447036743164 | 2.99 |
| 44.7220993041992 | 2.988 |
| 44.7708778381348 | 2.988 |
| 44.9073257446289 | 2.989 |
| 44.5592727661133 | 2.995 |
| 44.8119926452637 | 3.077 |
| 45.5832138061523 | 3.079 |
| 45.7043762207031 | 3.079 |
| 45.8380699157715 | 3.079 |
| 46.0161819458008 | 3.079 |
| 46.2555503845215 | 3.08 |
| 46.4987258911133 | 3.082 |
| 46.5365409851074 | 3.017 |
| 46.8937339782715 | 3.014 |
| 47.3720855712891 | 3.014 |
| 47.4597854614258 | 3.016 |
| 47.5102806091309 | 3.015 |
| 47.8672065734863 | 3.014 |
| 48.0222282409668 | 3.014 |
| 48.0203742980957 | 3.014 |
| 48.0173759460449 | 3.015 |
| 48.0797386169434 | 3.014 |
| 48.1635780334473 | 3.015 |
| 48.1169929504395 | 3.015 |
| 47.9932594299316 | 3.014 |
| 48.0628395080566 | 3.016 |
| 47.9471664428711 | 3.016 |
| 47.8653335571289 | 3.016 |
| 47.5457382202148 | 3.018 |
| 47.3995780944824 | 3.017 |
| 47.4213371276855 | 3.017 |
| 47.3065528869629 | 3.017 |
| 47.2744064331055 | 3.024 |
| 47.4968338012695 | 3.091 |
| 47.2820854187012 | 3.085 |
| 47.4722061157227 | 3.085 |
| 47.6386489868164 | 3.084 |
| 47.9658012390137 | 3.084 |
| 47.986156463623 | 3.084 |
| 48.0024871826172 | 3.082 |
| 47.9996299743652 | 3.082 |